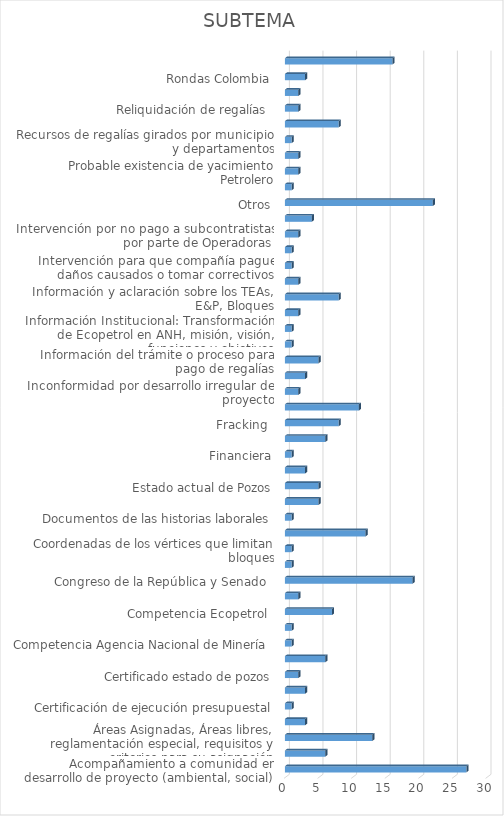
| Category | CANTIDAD |
|---|---|
| Acompañamiento a comunidad en desarrollo de proyecto (ambiental, social) | 27 |
| Actividad Hidrocarburífera en regiones del país | 6 |
| Áreas Asignadas, Áreas libres, reglamentación especial, requisitos y criterios para su asignación | 13 |
| Cartografía zonas Petrolera | 3 |
| Certificación de ejecución presupuestal | 1 |
| Certificaciones: Regalías, Giros de regalías y embargos de las mismas | 3 |
| Certificado estado de pozos | 2 |
| Cifras oficiales de producción en el país (producción, precio, demanda, Columnas Estratigráficas | 6 |
| Competencia Agencia Nacional de Minería  | 1 |
| Competencia Autoridad Nacional de Licencias Ambientales  | 1 |
| Competencia Ecopetrol  | 7 |
| Comportamiento del mercado de hidrocarburos en Colombia (producción y consumo interno petróleo y gas) | 2 |
| Congreso de la República y Senado  | 19 |
| Congreso y Senado de la República | 1 |
| Coordenadas de los vértices que limitan bloques | 1 |
| Copias de contratos (E&P, TEAS y Administrativos) | 12 |
| Documentos de las historias laborales | 1 |
| Empresas con pozos en producción o exploración | 5 |
| Estado actual de Pozos | 5 |
| Estudios geofísicos y de sísmica | 3 |
| Financiera | 1 |
| Fiscalización  | 6 |
| Fracking  | 8 |
| Incoder Titulación de Baldíos  | 11 |
| Inconformidad por desarrollo irregular de proyecto | 2 |
| Información de Operadores en Colombia | 3 |
| Información del trámite o proceso para pago de regalías | 5 |
| Información en formato shapefile acerca de las reservas naturales, humedales y comunidades | 1 |
| Información Institucional: Transformación de Ecopetrol en ANH, misión, visión, funciones y objetivos | 1 |
| Información proyectos de perforación y profundidad | 2 |
| Información y aclaración sobre los TEAs, E&P, Bloques | 8 |
| Informes sobres Consultas previas | 2 |
| Intervención para que compañía pague daños causados o tomar correctivos | 1 |
| Intervención para que operador vincule personal | 1 |
| Intervención por no pago a subcontratistas por parte de Operadoras  | 2 |
| Listas de Elegibles | 4 |
| Otros | 22 |
| Posibilidades petrolifícas en Colombia | 1 |
| Probable existencia de yacimiento Petrolero | 2 |
| Proyección Exploración y Producción de Petróleo en Colombia | 2 |
| Recursos de regalías girados por municipio y departamentos | 1 |
| Reliquidación de regalías | 8 |
| Reliquidación de regalías  | 2 |
| Reservas probadas ó estimadas de Hidrocarburos en Colombia | 2 |
| Rondas Colombia | 3 |
| (en blanco) | 16 |